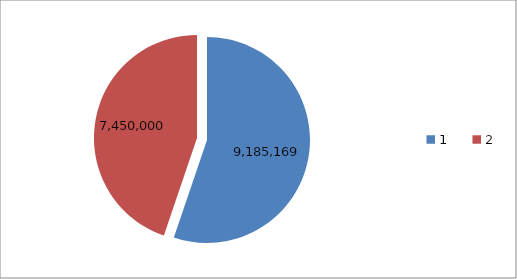
| Category | Series 0 |
|---|---|
| 0 | 9185169 |
| 1 | 7450000 |